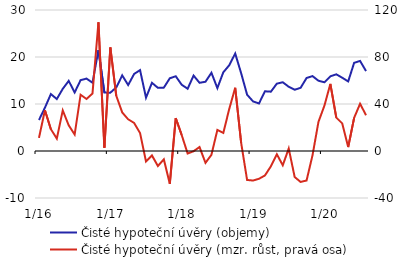
| Category | Čisté hypoteční úvěry (objemy) |
|---|---|
|  1/16 | 6.595 |
| 2 | 9.209 |
| 3 | 12.11 |
| 4 | 11.056 |
| 5 | 13.231 |
| 6 | 14.924 |
| 7 | 12.457 |
| 8 | 15.08 |
| 9 | 15.402 |
| 10 | 14.526 |
| 11 | 21.476 |
| 12 | 12.426 |
|  1/17 | 12.407 |
| 2 | 13.532 |
| 3 | 16.082 |
| 4 | 14.037 |
| 5 | 16.389 |
| 6 | 17.21 |
| 7 | 11.35 |
| 8 | 14.507 |
| 9 | 13.438 |
| 10 | 13.483 |
| 11 | 15.471 |
| 12 | 15.901 |
|  1/18 | 14.098 |
| 2 | 13.242 |
| 3 | 16.05 |
| 4 | 14.512 |
| 5 | 14.735 |
| 6 | 16.649 |
| 7 | 13.383 |
| 8 | 16.743 |
| 9 | 18.25 |
| 10 | 20.74 |
| 11 | 16.547 |
| 12 | 11.98 |
|  1/19 | 10.554 |
| 2 | 10.113 |
| 3 | 12.707 |
| 4 | 12.621 |
| 5 | 14.329 |
| 6 | 14.627 |
| 7 | 13.667 |
| 8 | 13.036 |
| 9 | 13.441 |
| 10 | 15.534 |
| 11 | 15.936 |
| 12 | 14.95 |
|  1/20 | 14.622 |
| 2 | 15.887 |
| 3 | 16.318 |
| 4 | 15.586 |
| 5 | 14.804 |
| 6 | 18.757 |
| 7 | 19.162 |
| 8 | 17.007 |